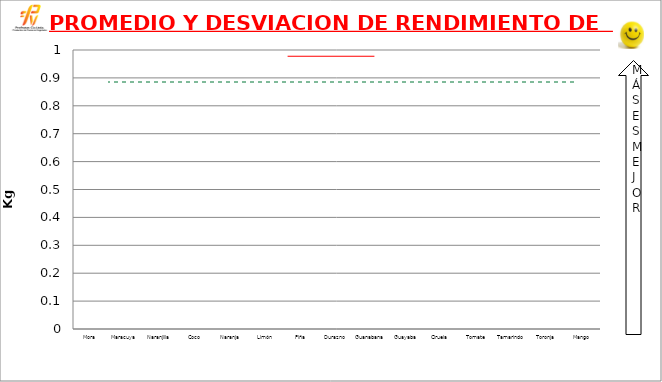
| Category | Promedio del Rendimiento | Desviacion del promedio |
|---|---|---|
| Mora | 0 | 0 |
| Maracuya | 0 | 0 |
| Naranjilla | 0 | 0 |
| Coco | 0 | 0 |
| Naranja | 0 | 0 |
| Limón | 0 | 0 |
| Piña | 0 | 0 |
| Durazno | 0 | 0 |
| Guanabana | 0 | 0 |
| Guayaba | 0 | 0 |
| Ciruela | 0 | 0 |
| Tomate | 0 | 0 |
| Tamarindo | 0 | 0 |
| Toronja | 0 | 0 |
| Mango | 0 | 0 |